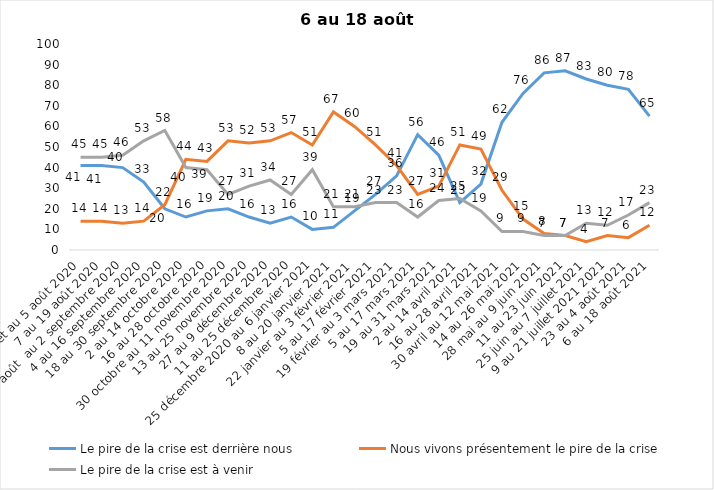
| Category | Le pire de la crise est derrière nous | Nous vivons présentement le pire de la crise | Le pire de la crise est à venir |
|---|---|---|---|
| 24 juillet au 5 août 2020 | 41 | 14 | 45 |
| 7 au 19 août 2020 | 41 | 14 | 45 |
| 21 août  au 2 septembre 2020 | 40 | 13 | 46 |
| 4 au 16 septembre 2020 | 33 | 14 | 53 |
| 18 au 30 septembre 2020 | 20 | 22 | 58 |
| 2 au 14 octobre 2020 | 16 | 44 | 40 |
| 16 au 28 octobre 2020 | 19 | 43 | 39 |
| 30 octobre au 11 novembre 2020 | 20 | 53 | 27 |
| 13 au 25 novembre 2020 | 16 | 52 | 31 |
| 27 au 9 décembre 2020 | 13 | 53 | 34 |
| 11 au 25 décembre 2020 | 16 | 57 | 27 |
| 25 décembre 2020 au 6 janvier 2021 | 10 | 51 | 39 |
| 8 au 20 janvier 2021 | 11 | 67 | 21 |
| 22 janvier au 3 février 2021 | 19 | 60 | 21 |
| 5 au 17 février 2021 | 27 | 51 | 23 |
| 19 février au 3 mars 2021 | 36 | 41 | 23 |
| 5 au 17 mars 2021 | 56 | 27 | 16 |
| 19 au 31 mars 2021 | 46 | 31 | 24 |
| 2 au 14 avril 2021 | 23 | 51 | 25 |
| 16 au 28 avril 2021 | 32 | 49 | 19 |
| 30 avril au 12 mai 2021 | 62 | 29 | 9 |
| 14 au 26 mai 2021 | 76 | 15 | 9 |
| 28 mai au 9 juin 2021 | 86 | 8 | 7 |
| 11 au 23 juin 2021 | 87 | 7 | 7 |
| 25 juin au 7 juillet 2021 | 83 | 4 | 13 |
| 9 au 21 juillet 2021 2021 | 80 | 7 | 12 |
| 23 au 4 août 2021 | 78 | 6 | 17 |
| 6 au 18 août 2021 | 65 | 12 | 23 |